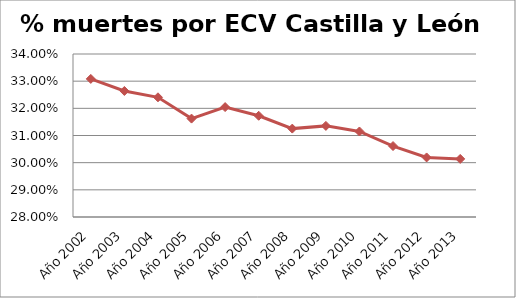
| Category | Series 0 |
|---|---|
| Año 2002 | 0.331 |
| Año 2003 | 0.326 |
| Año 2004 | 0.324 |
| Año 2005 | 0.316 |
| Año 2006 | 0.32 |
| Año 2007 | 0.317 |
| Año 2008 | 0.313 |
| Año 2009 | 0.314 |
| Año 2010 | 0.311 |
| Año 2011 | 0.306 |
| Año 2012 | 0.302 |
| Año 2013 | 0.301 |